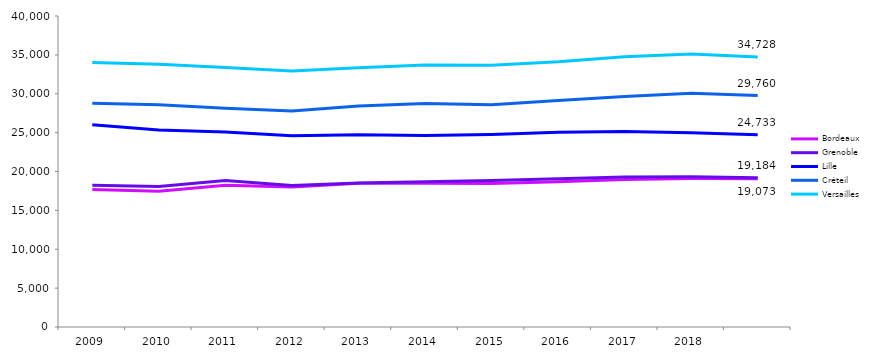
| Category | Bordeaux | Grenoble | Lille | Créteil | Versailles |
|---|---|---|---|---|---|
| 2009.0 | 17685 | 18232 | 25998 | 28775 | 34008 |
| 2010.0 | 17460 | 18058 | 25345 | 28581 | 33791 |
| 2011.0 | 18233 | 18839 | 25065 | 28149 | 33375 |
| 2012.0 | 18016 | 18208 | 24599 | 27776 | 32937 |
| 2013.0 | 18493 | 18532 | 24733 | 28422 | 33354 |
| 2014.0 | 18484 | 18689 | 24618 | 28742 | 33686 |
| 2015.0 | 18459 | 18832 | 24756 | 28582 | 33674 |
| 2016.0 | 18686 | 19073 | 25042 | 29128 | 34114 |
| 2017.0 | 18979 | 19283 | 25144 | 29639 | 34755 |
| 2018.0 | 19108 | 19317 | 24975 | 30077 | 35114 |